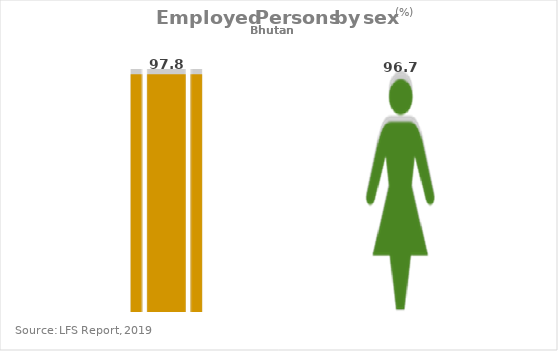
| Category | Gray series |
|---|---|
| Male | 100 |
| Female | 100 |